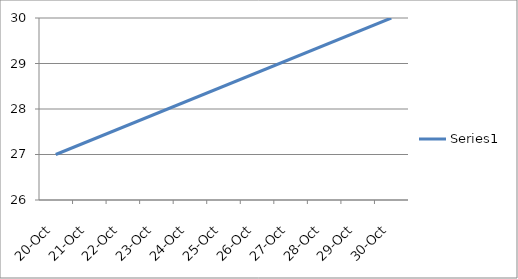
| Category | Series 0 |
|---|---|
| 2011-10-20 | 27 |
| 2011-10-30 | 30 |